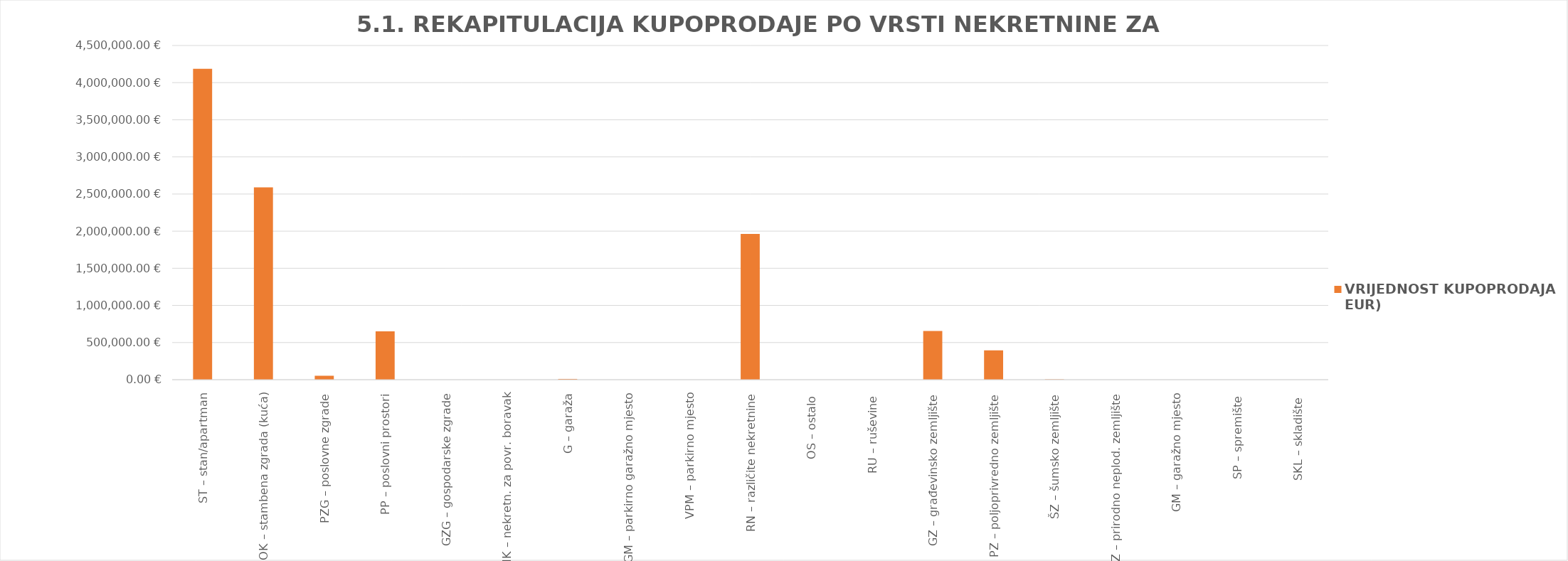
| Category | VRIJEDNOST KUPOPRODAJA (u EUR) |
|---|---|
| ST – stan/apartman | 4186131.946 |
| OK – stambena zgrada (kuća) | 2589600 |
| PZG – poslovne zgrade | 53000 |
| PP – poslovni prostori | 650595.6 |
| GZG – gospodarske zgrade | 0 |
| VIK – nekretn. za povr. boravak | 0 |
| G – garaža | 10184.66 |
| PGM – parkirno garažno mjesto | 0 |
| VPM – parkirno mjesto | 0 |
| RN – različite nekretnine | 1963330.469 |
| OS – ostalo  | 200 |
| RU – ruševine  | 0 |
| GZ – građevinsko zemljište | 656113.721 |
| PZ – poljoprivredno zemljište | 395431.463 |
| ŠZ – šumsko zemljište | 4500 |
| PNZ – prirodno neplod. zemljište | 0 |
| GM – garažno mjesto | 0 |
| SP – spremište  | 0 |
| SKL – skladište  | 0 |